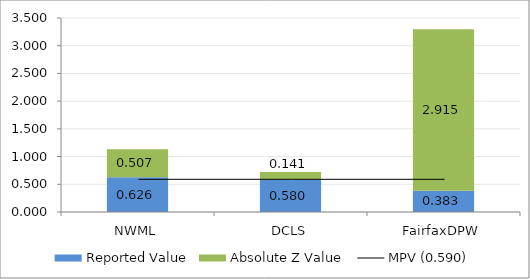
| Category | Reported Value | Absolute Z Value  |
|---|---|---|
| NWML | 0.626 | 0.507 |
| DCLS | 0.58 | 0.141 |
| FairfaxDPW | 0.383 | 2.915 |